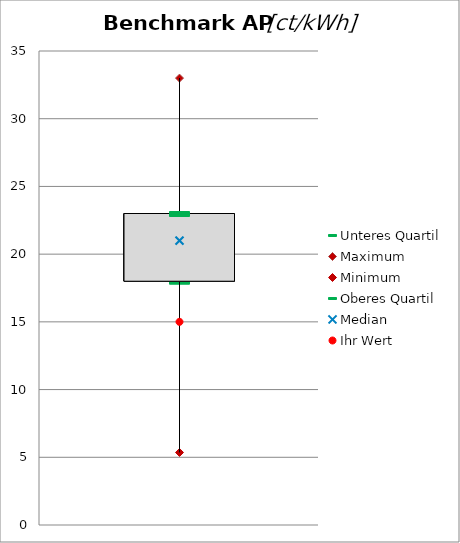
| Category | Unteres Quartil | Maximum | Minimum | Oberes Quartil |
|---|---|---|---|---|
| AP [ct/kWh] | 18 | 33 | 5.355 | 23 |